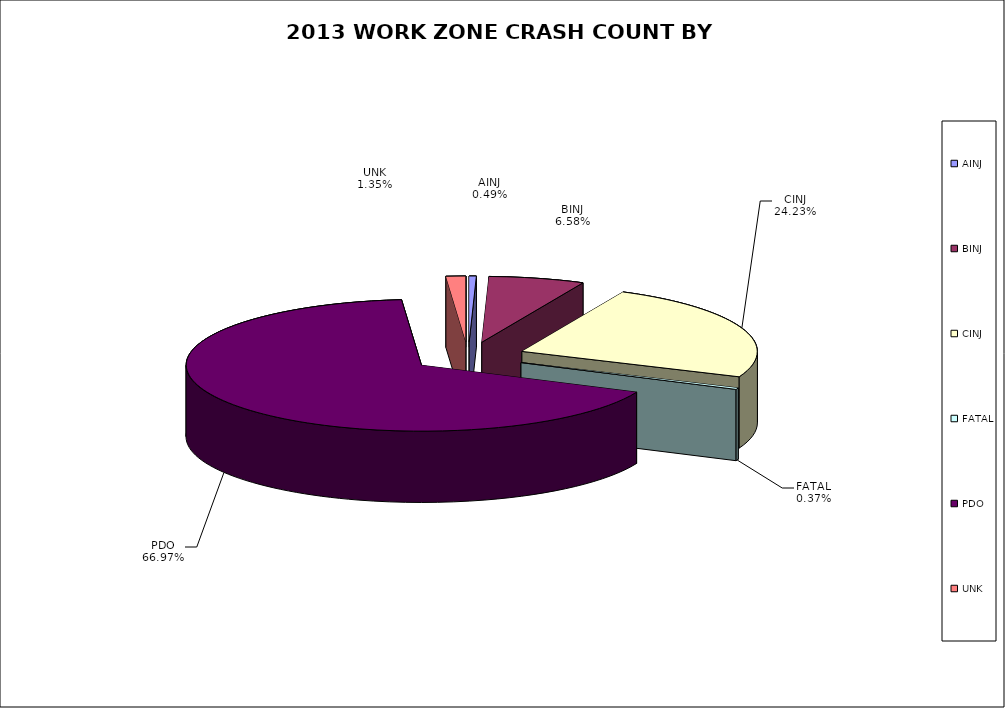
| Category | Series 0 | Series 1 |
|---|---|---|
| AINJ | 17 | 0.005 |
| BINJ | 229 | 0.066 |
| CINJ | 843 | 0.242 |
| FATAL | 13 | 0.004 |
| PDO | 2330 | 0.67 |
| UNK | 47 | 0.014 |